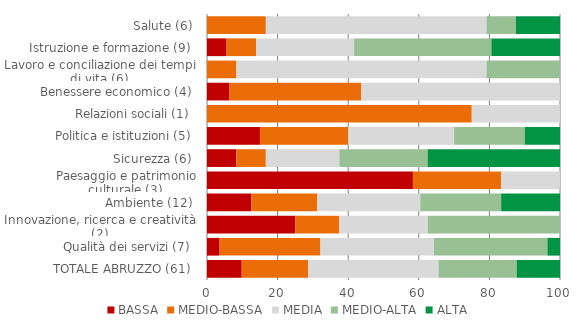
| Category | BASSA | MEDIO-BASSA | MEDIA | MEDIO-ALTA | ALTA |
|---|---|---|---|---|---|
| TOTALE ABRUZZO (61)  | 9.836 | 18.852 | 36.885 | 22.131 | 12.295 |
| Qualità dei servizi (7)  | 3.571 | 28.571 | 32.143 | 32.143 | 3.571 |
| Innovazione, ricerca e creatività (2)  | 25 | 12.5 | 25 | 37.5 | 0 |
| Ambiente (12)  | 12.5 | 18.75 | 29.167 | 22.917 | 16.667 |
| Paesaggio e patrimonio culturale (3)  | 58.333 | 25 | 16.667 | 0 | 0 |
| Sicurezza (6)  | 8.333 | 8.333 | 20.833 | 25 | 37.5 |
| Politica e istituzioni (5)  | 15 | 25 | 30 | 20 | 10 |
| Relazioni sociali (1)  | 0 | 75 | 25 | 0 | 0 |
| Benessere economico (4)  | 6.25 | 37.5 | 56.25 | 0 | 0 |
| Lavoro e conciliazione dei tempi di vita (6)  | 0 | 8.333 | 70.833 | 20.833 | 0 |
| Istruzione e formazione (9)  | 5.556 | 8.333 | 27.778 | 38.889 | 19.444 |
| Salute (6)  | 0 | 16.667 | 62.5 | 8.333 | 12.5 |